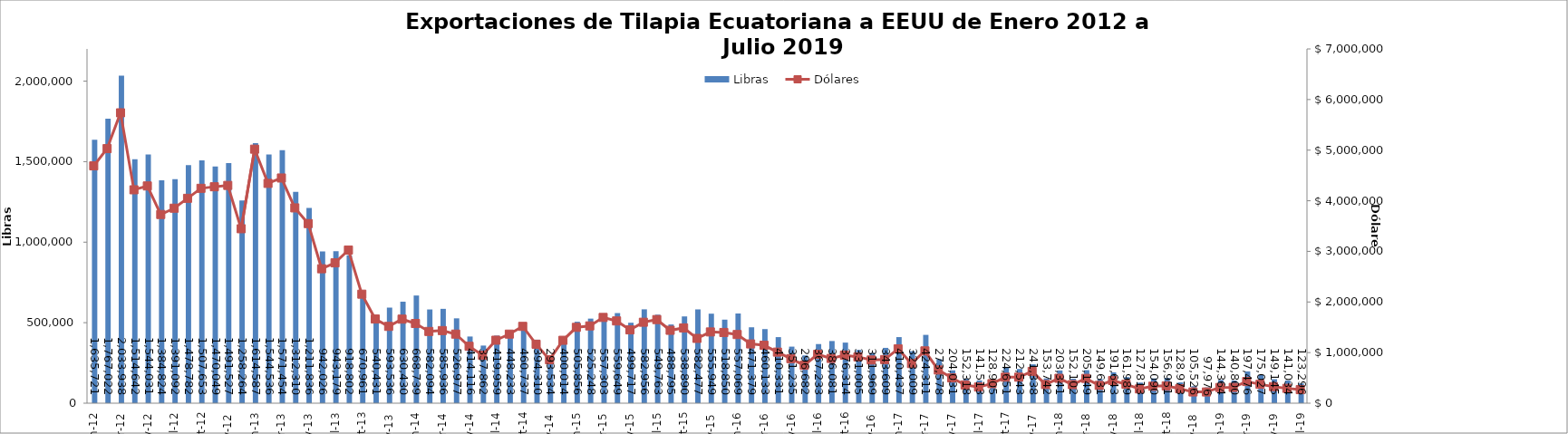
| Category | Libras  |
|---|---|
| 2012-01-01 | 1635720.607 |
| 2012-02-01 | 1767022.174 |
| 2012-03-01 | 2033937.505 |
| 2012-04-01 | 1514641.77 |
| 2012-05-01 | 1544031.293 |
| 2012-06-01 | 1384823.899 |
| 2012-07-01 | 1391091.577 |
| 2012-08-01 | 1478781.747 |
| 2012-09-01 | 1507653.188 |
| 2012-10-01 | 1470049.326 |
| 2012-11-01 | 1491526.539 |
| 2012-12-01 | 1258264 |
| 2013-01-01 | 1614587 |
| 2013-02-01 | 1544536.146 |
| 2013-03-01 | 1571454.312 |
| 2013-04-01 | 1312310.196 |
| 2013-05-01 | 1211835.551 |
| 2013-06-01 | 942025.58 |
| 2013-07-01 | 943178.586 |
| 2013-08-01 | 918802.324 |
| 2013-09-01 | 670961.192 |
| 2013-10-01 | 540431.235 |
| 2013-11-01 | 593535.64 |
| 2013-12-01 | 630429.621 |
| 2014-01-01 | 668739 |
| 2014-02-01 | 582093.766 |
| 2014-03-01 | 585936.383 |
| 2014-04-01 | 526976.561 |
| 2014-05-01 | 414116.473 |
| 2014-06-01 | 357861.695 |
| 2014-07-01 | 419958.663 |
| 2014-08-01 | 448233 |
| 2014-09-01 | 460737.149 |
| 2014-10-01 | 394310.347 |
| 2014-11-01 | 293533.672 |
| 2014-12-01 | 400013.647 |
| 2015-01-01 | 505856.493 |
| 2015-02-01 | 525248 |
| 2015-03-01 | 557303.039 |
| 2015-04-01 | 559648.733 |
| 2015-05-01 | 499716.682 |
| 2015-06-01 | 582955.764 |
| 2015-07-01 | 549763.307 |
| 2015-08-01 | 488795.094 |
| 2015-09-01 | 538890.219 |
| 2015-10-01 | 582477.366 |
| 2015-11-01 | 555949.414 |
| 2015-12-01 | 518850.405 |
| 2016-01-01 | 557069.351 |
| 2016-02-01 | 471378.754 |
| 2016-03-01 | 460133.089 |
| 2016-04-01 | 410331.175 |
| 2016-05-01 | 351235 |
| 2016-06-01 | 296682 |
| 2016-07-01 | 367233.45 |
| 2016-08-01 | 386080.575 |
| 2016-09-01 | 376314.197 |
| 2016-10-01 | 331005.258 |
| 2016-11-01 | 311968.537 |
| 2016-12-01 | 343608.956 |
| 2017-01-01 | 410436.996 |
| 2017-02-01 | 323009.174 |
| 2017-03-01 | 424310.544 |
| 2017-04-01 | 273577.632 |
| 2017-05-01 | 204031.321 |
| 2017-06-01 | 152318.019 |
| 2017-07-01 | 141513.274 |
| 2017-08-01 | 128905.167 |
| 2017-09-01 | 224650.945 |
| 2017-10-01 | 212543.281 |
| 2017-11-01 | 241337.562 |
| 2017-12-01 | 153742.19 |
| 2018-01-01 | 203341.281 |
| 2018-02-01 | 152101.968 |
| 2018-03-01 | 205149.053 |
| 2018-04-01 | 149630.611 |
| 2018-05-01 | 191643 |
| 2018-06-01 | 161989 |
| 2018-07-01 | 127813 |
| 2018-08-01 | 154089.894 |
| 2018-09-01 | 156951.494 |
| 2018-10-01 | 128972.628 |
| 2018-11-01 | 105526.466 |
| 2018-12-01 | 97975.634 |
| 2019-01-01 | 144364.157 |
| 2019-02-01 | 140800 |
| 2019-03-01 | 197476 |
| 2019-04-01 | 175027.19 |
| 2019-05-01 | 149144.92 |
| 2019-06-01 | 141034.12 |
| 2019-07-01 | 123295.72 |